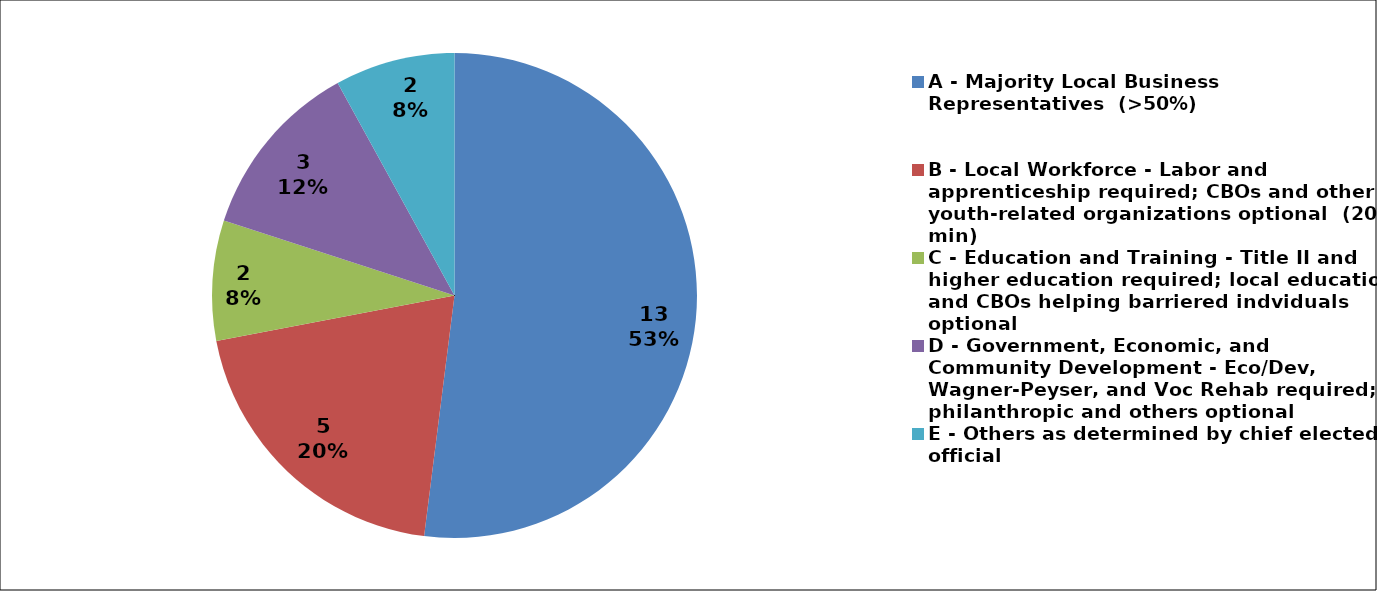
| Category | Series 0 |
|---|---|
| A - Majority Local Business Representatives  (>50%) | 13 |
| B - Local Workforce - Labor and apprenticeship required; CBOs and other youth-related organizations optional  (20% min) | 5 |
| C - Education and Training - Title II and higher education required; local education and CBOs helping barriered indviduals optional | 2 |
| D - Government, Economic, and Community Development - Eco/Dev, Wagner-Peyser, and Voc Rehab required; philanthropic and others optional | 3 |
| E - Others as determined by chief elected official | 2 |